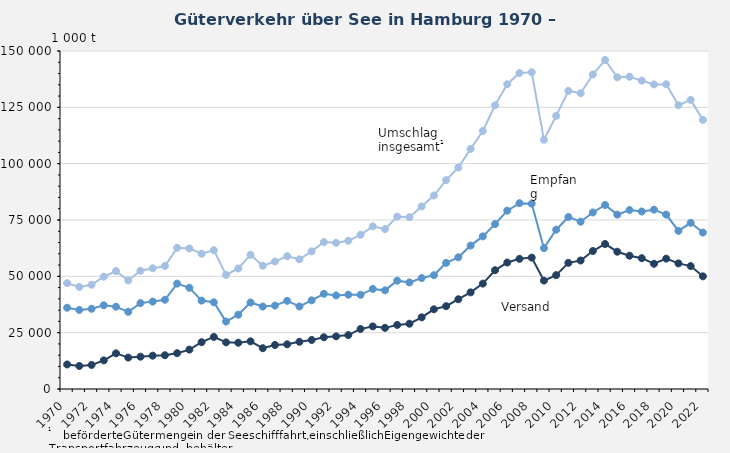
| Category | Umschlag insgesamt1 | Empfang | Versand |
|---|---|---|---|
| 1970.0 | 46959 | 36069 | 10890 |
| 1971.0 | 45303 | 35090 | 10213 |
| 1972.0 | 46255 | 35581 | 10674 |
| 1973.0 | 49850 | 37154 | 12696 |
| 1974.0 | 52349 | 36527 | 15822 |
| 1975.0 | 48181 | 34240 | 13941 |
| 1976.0 | 52460 | 38120 | 14340 |
| 1977.0 | 53574 | 38788 | 14786 |
| 1978.0 | 54596 | 39614 | 14982 |
| 1979.0 | 62650 | 46758 | 15892 |
| 1980.0 | 62393 | 44911 | 17482 |
| 1981.0 | 60027 | 39234 | 20793 |
| 1982.0 | 61581 | 38482 | 23099 |
| 1983.0 | 50631 | 29935 | 20696 |
| 1984.0 | 53488 | 32959 | 20529 |
| 1985.0 | 59535 | 38380 | 21155 |
| 1986.0 | 54696 | 36584 | 18112 |
| 1987.0 | 56570 | 37026 | 19544 |
| 1988.0 | 58942 | 39114 | 19828 |
| 1989.0 | 57582 | 36630 | 20952 |
| 1990.0 | 61098 | 39340 | 21758 |
| 1991.0 | 65204 | 42243 | 22961 |
| 1992.0 | 64881 | 41522 | 23359 |
| 1993.0 | 65772 | 41846 | 23926 |
| 1994.0 | 68439 | 41799 | 26640 |
| 1995.0 | 72189 | 44404 | 27785 |
| 1996.0 | 70920 | 43782 | 27138 |
| 1997.0 | 76503 | 48077 | 28426 |
| 1998.0 | 76264 | 47298 | 28966 |
| 1999.0 | 81036 | 49232 | 31805 |
| 2000.0 | 85863 | 50493 | 35370 |
| 2001.0 | 92709 | 55960 | 36749 |
| 2002.0 | 98272 | 58439 | 39833 |
| 2003.0 | 106536 | 63649 | 42887 |
| 2004.0 | 114501 | 67731 | 46770 |
| 2005.0 | 125894 | 73183 | 52711 |
| 2006.0 | 135259 | 79137 | 56122 |
| 2007.0 | 140236 | 82472 | 57764 |
| 2008.0 | 140562 | 82255 | 58307 |
| 2009.0 | 110604 | 62497 | 48107 |
| 2010.0 | 121222 | 70700 | 50522 |
| 2011.0 | 132293 | 76315 | 55978 |
| 2012.0 | 131269 | 74237 | 57033 |
| 2013.0 | 139573 | 78335 | 61238 |
| 2014.0 | 146000 | 81648 | 64352 |
| 2015.0 | 138311 | 77387 | 60925 |
| 2016.0 | 138585 | 79435 | 59151 |
| 2017.0 | 136839 | 78781 | 58057 |
| 2018.0 | 135163 | 79587 | 55577 |
| 2019.0 | 135271 | 77410 | 57860 |
| 2020.0 | 125911 | 70166 | 55745 |
| 2021.0 | 128307 | 73758 | 54549 |
| 2022.0 | 119426 | 69424 | 50002 |